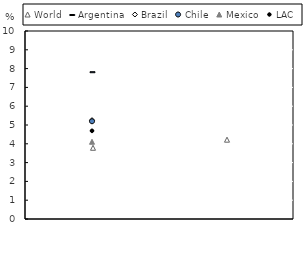
| Category | World |
|---|---|
| 0 | 3.788 |
| 1 | 4.219 |